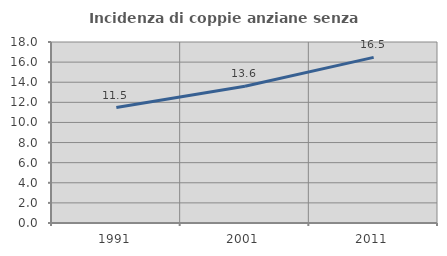
| Category | Incidenza di coppie anziane senza figli  |
|---|---|
| 1991.0 | 11.482 |
| 2001.0 | 13.602 |
| 2011.0 | 16.473 |